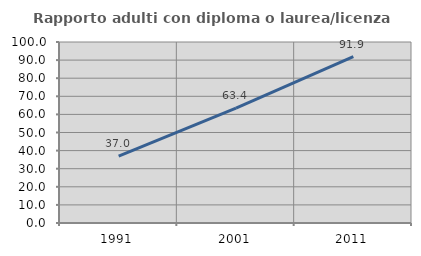
| Category | Rapporto adulti con diploma o laurea/licenza media  |
|---|---|
| 1991.0 | 36.957 |
| 2001.0 | 63.415 |
| 2011.0 | 91.935 |